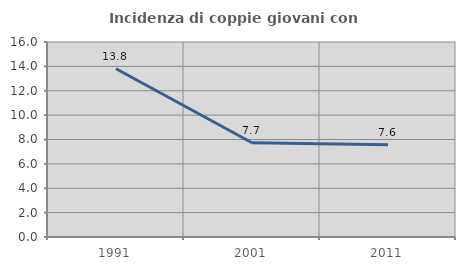
| Category | Incidenza di coppie giovani con figli |
|---|---|
| 1991.0 | 13.803 |
| 2001.0 | 7.735 |
| 2011.0 | 7.57 |